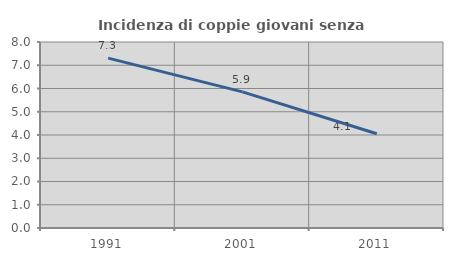
| Category | Incidenza di coppie giovani senza figli |
|---|---|
| 1991.0 | 7.306 |
| 2001.0 | 5.855 |
| 2011.0 | 4.054 |